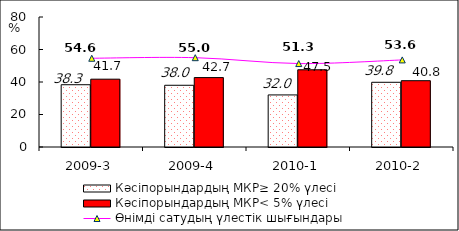
| Category | Кәсіпорындардың МКР≥ 20% үлесі | Кәсіпорындардың МКР< 5% үлесі |
|---|---|---|
| 2009-3 | 38.32 | 41.74 |
| 2009-4 | 37.99 | 42.72 |
| 2010-1 | 32.04 | 47.51 |
| 2010-2 | 39.82 | 40.8 |